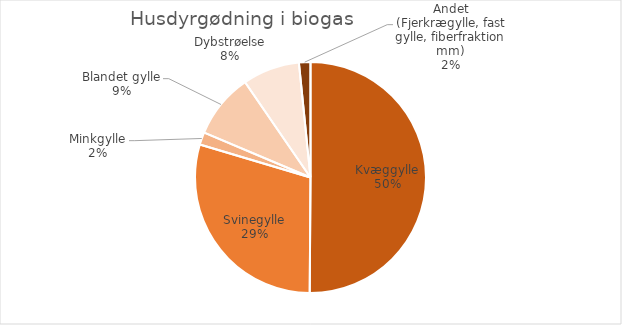
| Category | Series 0 |
|---|---|
| Kvæggylle | 3675241.96 |
| Svinegylle | 2163739.23 |
| Minkgylle | 128480.5 |
| Blandet gylle | 664463.09 |
| Dybstrøelse | 585039.28 |
| Andet (Fjerkrægylle, fast gylle, fiberfraktion mm) | 117631.46 |